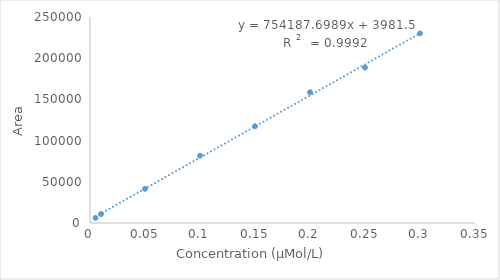
| Category | Series 0 |
|---|---|
| 0.005 | 6199.19 |
| 0.01 | 10909.46 |
| 0.05 | 41433.44 |
| 0.1 | 81727.168 |
| 0.15 | 117419.785 |
| 0.2 | 158639.133 |
| 0.25 | 188662.364 |
| 0.3 | 230071.359 |